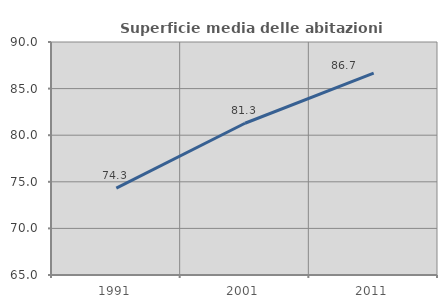
| Category | Superficie media delle abitazioni occupate |
|---|---|
| 1991.0 | 74.325 |
| 2001.0 | 81.281 |
| 2011.0 | 86.663 |